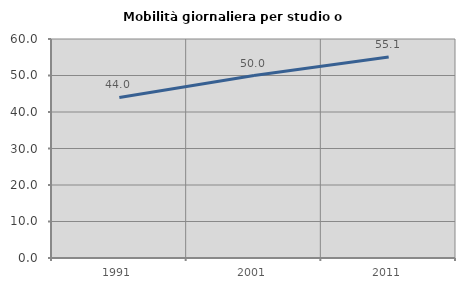
| Category | Mobilità giornaliera per studio o lavoro |
|---|---|
| 1991.0 | 43.987 |
| 2001.0 | 50 |
| 2011.0 | 55.059 |